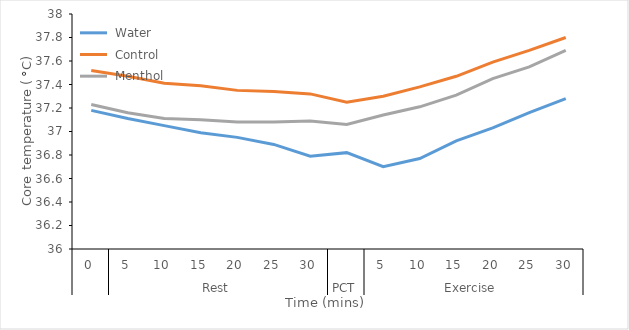
| Category |  Water |  Control |  Menthol |
|---|---|---|---|
| 0 | 37.18 | 37.52 | 37.23 |
| 1 | 37.11 | 37.47 | 37.16 |
| 2 | 37.05 | 37.41 | 37.11 |
| 3 | 36.99 | 37.39 | 37.1 |
| 4 | 36.95 | 37.35 | 37.08 |
| 5 | 36.89 | 37.34 | 37.08 |
| 6 | 36.79 | 37.32 | 37.09 |
| 7 | 36.82 | 37.25 | 37.06 |
| 8 | 36.7 | 37.3 | 37.14 |
| 9 | 36.77 | 37.38 | 37.21 |
| 10 | 36.92 | 37.47 | 37.31 |
| 11 | 37.03 | 37.59 | 37.45 |
| 12 | 37.16 | 37.69 | 37.55 |
| 13 | 37.28 | 37.8 | 37.69 |